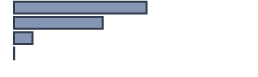
| Category | Percentatge |
|---|---|
| 0 | 55.227 |
| 1 | 36.97 |
| 2 | 7.727 |
| 3 | 0.076 |